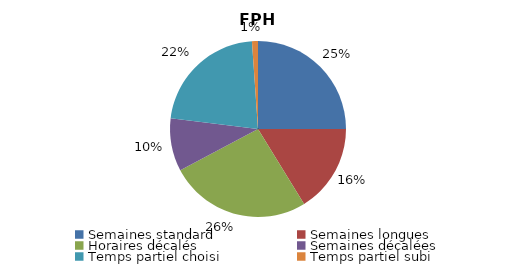
| Category | FPH | FPE |
|---|---|---|
| Semaines standard | 25.013 | 45.14 |
| Semaines longues | 16.21 | 19.788 |
| Horaires décalés | 26.012 | 4.898 |
| Semaines décalées | 9.71 | 12.83 |
| Temps partiel choisi | 21.956 | 12.093 |
| Temps partiel subi | 1.098 | 5.251 |